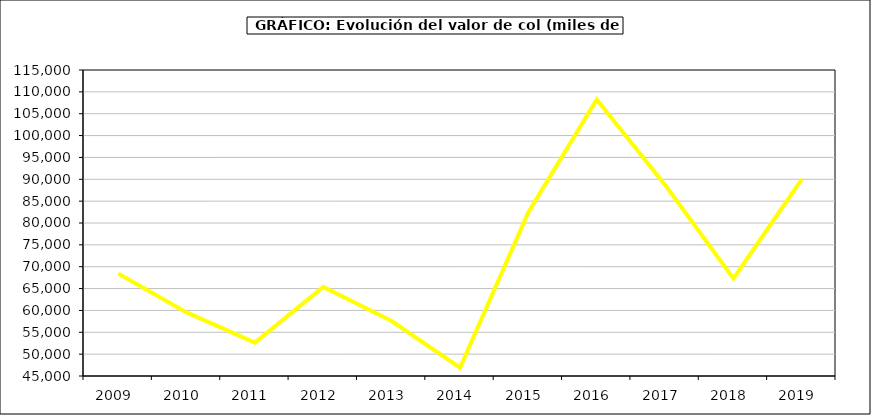
| Category | Valor |
|---|---|
| 2009.0 | 68429.192 |
| 2010.0 | 59556.292 |
| 2011.0 | 52642.369 |
| 2012.0 | 65369.978 |
| 2013.0 | 57574.735 |
| 2014.0 | 46884.616 |
| 2015.0 | 82468.9 |
| 2016.0 | 108241.9 |
| 2017.0 | 88707.96 |
| 2018.0 | 67321.637 |
| 2019.0 | 90049.076 |